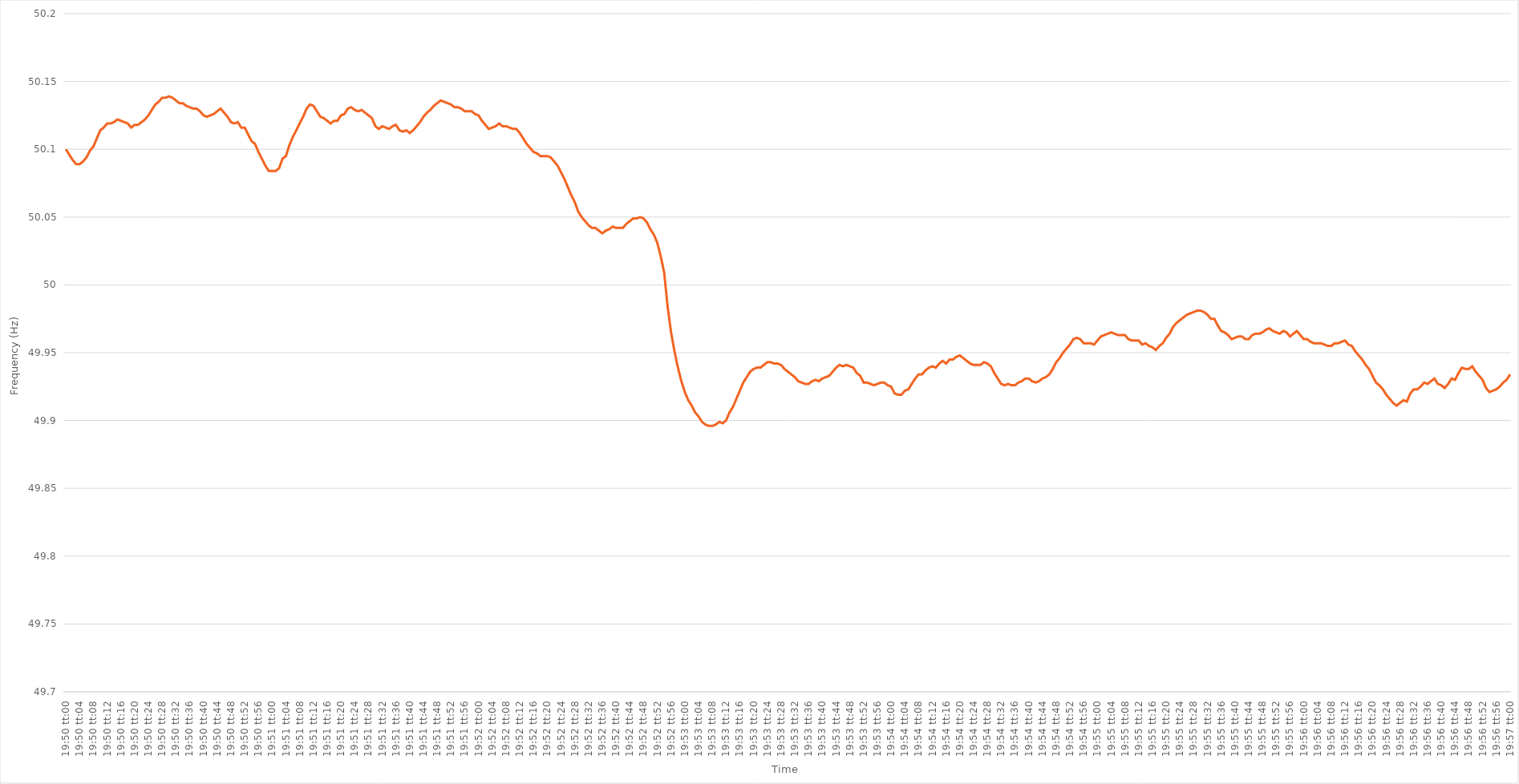
| Category | Series 0 |
|---|---|
| 0.8263888888888888 | 50.1 |
| 0.826400462962963 | 50.096 |
| 0.826412037037037 | 50.092 |
| 0.8264236111111112 | 50.089 |
| 0.8264351851851851 | 50.089 |
| 0.8264467592592593 | 50.091 |
| 0.8264583333333334 | 50.094 |
| 0.8264699074074073 | 50.099 |
| 0.8264814814814815 | 50.102 |
| 0.8264930555555555 | 50.108 |
| 0.8265046296296297 | 50.114 |
| 0.8265162037037036 | 50.116 |
| 0.8265277777777778 | 50.119 |
| 0.8265393518518519 | 50.119 |
| 0.8265509259259259 | 50.12 |
| 0.8265625 | 50.122 |
| 0.826574074074074 | 50.121 |
| 0.8265856481481482 | 50.12 |
| 0.8265972222222223 | 50.119 |
| 0.8266087962962962 | 50.116 |
| 0.8266203703703704 | 50.118 |
| 0.8266319444444444 | 50.118 |
| 0.8266435185185186 | 50.12 |
| 0.8266550925925925 | 50.122 |
| 0.8266666666666667 | 50.125 |
| 0.8266782407407408 | 50.129 |
| 0.8266898148148147 | 50.133 |
| 0.8267013888888889 | 50.135 |
| 0.8267129629629629 | 50.138 |
| 0.8267245370370371 | 50.138 |
| 0.826736111111111 | 50.139 |
| 0.8267476851851852 | 50.138 |
| 0.8267592592592593 | 50.136 |
| 0.8267708333333333 | 50.134 |
| 0.8267824074074074 | 50.134 |
| 0.8267939814814814 | 50.132 |
| 0.8268055555555556 | 50.131 |
| 0.8268171296296297 | 50.13 |
| 0.8268287037037036 | 50.13 |
| 0.8268402777777778 | 50.128 |
| 0.8268518518518518 | 50.125 |
| 0.826863425925926 | 50.124 |
| 0.8268749999999999 | 50.125 |
| 0.8268865740740741 | 50.126 |
| 0.8268981481481482 | 50.128 |
| 0.8269097222222223 | 50.13 |
| 0.8269212962962963 | 50.127 |
| 0.8269328703703703 | 50.124 |
| 0.8269444444444445 | 50.12 |
| 0.8269560185185186 | 50.119 |
| 0.8269675925925926 | 50.12 |
| 0.8269791666666667 | 50.116 |
| 0.8269907407407407 | 50.116 |
| 0.8270023148148148 | 50.111 |
| 0.8270138888888888 | 50.106 |
| 0.827025462962963 | 50.104 |
| 0.8270370370370371 | 50.098 |
| 0.827048611111111 | 50.093 |
| 0.8270601851851852 | 50.088 |
| 0.8270717592592592 | 50.084 |
| 0.8270833333333334 | 50.084 |
| 0.8270949074074073 | 50.084 |
| 0.8271064814814815 | 50.086 |
| 0.8271180555555556 | 50.093 |
| 0.8271296296296297 | 50.095 |
| 0.8271412037037037 | 50.103 |
| 0.8271527777777777 | 50.109 |
| 0.8271643518518519 | 50.114 |
| 0.827175925925926 | 50.119 |
| 0.8271875 | 50.124 |
| 0.8271990740740741 | 50.13 |
| 0.8272106481481482 | 50.133 |
| 0.8272222222222222 | 50.132 |
| 0.8272337962962962 | 50.128 |
| 0.8272453703703704 | 50.124 |
| 0.8272569444444445 | 50.123 |
| 0.8272685185185185 | 50.121 |
| 0.8272800925925926 | 50.119 |
| 0.8272916666666666 | 50.121 |
| 0.8273032407407408 | 50.121 |
| 0.8273148148148147 | 50.125 |
| 0.8273263888888889 | 50.126 |
| 0.827337962962963 | 50.13 |
| 0.8273495370370371 | 50.131 |
| 0.8273611111111111 | 50.129 |
| 0.8273726851851851 | 50.128 |
| 0.8273842592592593 | 50.129 |
| 0.8273958333333334 | 50.127 |
| 0.8274074074074074 | 50.125 |
| 0.8274189814814815 | 50.123 |
| 0.8274305555555556 | 50.117 |
| 0.8274421296296296 | 50.115 |
| 0.8274537037037036 | 50.117 |
| 0.8274652777777778 | 50.116 |
| 0.8274768518518519 | 50.115 |
| 0.8274884259259259 | 50.117 |
| 0.8275 | 50.118 |
| 0.827511574074074 | 50.114 |
| 0.8275231481481482 | 50.113 |
| 0.8275347222222221 | 50.114 |
| 0.8275462962962963 | 50.112 |
| 0.8275578703703704 | 50.114 |
| 0.8275694444444445 | 50.117 |
| 0.8275810185185185 | 50.12 |
| 0.8275925925925925 | 50.124 |
| 0.8276041666666667 | 50.127 |
| 0.8276157407407408 | 50.129 |
| 0.8276273148148148 | 50.132 |
| 0.8276388888888889 | 50.134 |
| 0.827650462962963 | 50.136 |
| 0.827662037037037 | 50.135 |
| 0.827673611111111 | 50.134 |
| 0.8276851851851852 | 50.133 |
| 0.8276967592592593 | 50.131 |
| 0.8277083333333333 | 50.131 |
| 0.8277199074074074 | 50.13 |
| 0.8277314814814815 | 50.128 |
| 0.8277430555555556 | 50.128 |
| 0.8277546296296295 | 50.128 |
| 0.8277662037037037 | 50.126 |
| 0.8277777777777778 | 50.125 |
| 0.8277893518518519 | 50.121 |
| 0.8278009259259259 | 50.118 |
| 0.8278125 | 50.115 |
| 0.8278240740740741 | 50.116 |
| 0.8278356481481483 | 50.117 |
| 0.8278472222222222 | 50.119 |
| 0.8278587962962963 | 50.117 |
| 0.8278703703703704 | 50.117 |
| 0.8278819444444444 | 50.116 |
| 0.8278935185185184 | 50.115 |
| 0.8279050925925926 | 50.115 |
| 0.8279166666666667 | 50.112 |
| 0.8279282407407407 | 50.108 |
| 0.8279398148148148 | 50.104 |
| 0.8279513888888889 | 50.101 |
| 0.827962962962963 | 50.098 |
| 0.8279745370370369 | 50.097 |
| 0.8279861111111111 | 50.095 |
| 0.8279976851851852 | 50.095 |
| 0.8280092592592593 | 50.095 |
| 0.8280208333333333 | 50.094 |
| 0.8280324074074074 | 50.091 |
| 0.8280439814814815 | 50.088 |
| 0.8280555555555557 | 50.083 |
| 0.8280671296296296 | 50.078 |
| 0.8280787037037037 | 50.072 |
| 0.8280902777777778 | 50.066 |
| 0.8281018518518519 | 50.061 |
| 0.8281134259259259 | 50.054 |
| 0.828125 | 50.05 |
| 0.8281365740740741 | 50.047 |
| 0.8281481481481481 | 50.044 |
| 0.8281597222222222 | 50.042 |
| 0.8281712962962963 | 50.042 |
| 0.8281828703703704 | 50.04 |
| 0.8281944444444443 | 50.038 |
| 0.8282060185185185 | 50.04 |
| 0.8282175925925926 | 50.041 |
| 0.8282291666666667 | 50.043 |
| 0.8282407407407407 | 50.042 |
| 0.8282523148148148 | 50.042 |
| 0.8282638888888889 | 50.042 |
| 0.8282754629629631 | 50.045 |
| 0.828287037037037 | 50.047 |
| 0.8282986111111111 | 50.049 |
| 0.8283101851851852 | 50.049 |
| 0.8283217592592593 | 50.05 |
| 0.8283333333333333 | 50.049 |
| 0.8283449074074074 | 50.046 |
| 0.8283564814814816 | 50.041 |
| 0.8283680555555556 | 50.037 |
| 0.8283796296296296 | 50.031 |
| 0.8283912037037037 | 50.021 |
| 0.8284027777777778 | 50.009 |
| 0.8284143518518517 | 49.984 |
| 0.8284259259259259 | 49.965 |
| 0.8284375 | 49.951 |
| 0.8284490740740741 | 49.939 |
| 0.8284606481481481 | 49.929 |
| 0.8284722222222222 | 49.921 |
| 0.8284837962962963 | 49.915 |
| 0.8284953703703705 | 49.911 |
| 0.8285069444444444 | 49.906 |
| 0.8285185185185185 | 49.903 |
| 0.8285300925925926 | 49.899 |
| 0.8285416666666667 | 49.897 |
| 0.8285532407407407 | 49.896 |
| 0.8285648148148148 | 49.896 |
| 0.828576388888889 | 49.897 |
| 0.828587962962963 | 49.899 |
| 0.828599537037037 | 49.898 |
| 0.8286111111111111 | 49.9 |
| 0.8286226851851852 | 49.906 |
| 0.8286342592592592 | 49.91 |
| 0.8286458333333333 | 49.916 |
| 0.8286574074074075 | 49.922 |
| 0.8286689814814815 | 49.928 |
| 0.8286805555555555 | 49.932 |
| 0.8286921296296296 | 49.936 |
| 0.8287037037037037 | 49.938 |
| 0.8287152777777779 | 49.939 |
| 0.8287268518518518 | 49.939 |
| 0.828738425925926 | 49.941 |
| 0.82875 | 49.943 |
| 0.8287615740740741 | 49.943 |
| 0.8287731481481481 | 49.942 |
| 0.8287847222222222 | 49.942 |
| 0.8287962962962964 | 49.941 |
| 0.8288078703703704 | 49.938 |
| 0.8288194444444444 | 49.936 |
| 0.8288310185185185 | 49.934 |
| 0.8288425925925926 | 49.932 |
| 0.8288541666666666 | 49.929 |
| 0.8288657407407407 | 49.928 |
| 0.8288773148148149 | 49.927 |
| 0.8288888888888889 | 49.927 |
| 0.8289004629629629 | 49.929 |
| 0.828912037037037 | 49.93 |
| 0.8289236111111111 | 49.929 |
| 0.8289351851851853 | 49.931 |
| 0.8289467592592592 | 49.932 |
| 0.8289583333333334 | 49.933 |
| 0.8289699074074074 | 49.936 |
| 0.8289814814814815 | 49.939 |
| 0.8289930555555555 | 49.941 |
| 0.8290046296296296 | 49.94 |
| 0.8290162037037038 | 49.941 |
| 0.8290277777777778 | 49.94 |
| 0.8290393518518518 | 49.939 |
| 0.8290509259259259 | 49.935 |
| 0.8290625 | 49.933 |
| 0.829074074074074 | 49.928 |
| 0.8290856481481481 | 49.928 |
| 0.8290972222222223 | 49.927 |
| 0.8291087962962963 | 49.926 |
| 0.8291203703703703 | 49.927 |
| 0.8291319444444444 | 49.928 |
| 0.8291435185185185 | 49.928 |
| 0.8291550925925927 | 49.926 |
| 0.8291666666666666 | 49.925 |
| 0.8291782407407408 | 49.92 |
| 0.8291898148148148 | 49.919 |
| 0.829201388888889 | 49.919 |
| 0.8292129629629629 | 49.922 |
| 0.829224537037037 | 49.923 |
| 0.8292361111111112 | 49.927 |
| 0.8292476851851852 | 49.931 |
| 0.8292592592592593 | 49.934 |
| 0.8292708333333333 | 49.934 |
| 0.8292824074074074 | 49.937 |
| 0.8292939814814814 | 49.939 |
| 0.8293055555555555 | 49.94 |
| 0.8293171296296297 | 49.939 |
| 0.8293287037037037 | 49.942 |
| 0.8293402777777777 | 49.944 |
| 0.8293518518518518 | 49.942 |
| 0.8293634259259259 | 49.945 |
| 0.8293750000000001 | 49.945 |
| 0.829386574074074 | 49.947 |
| 0.8293981481481482 | 49.948 |
| 0.8294097222222222 | 49.946 |
| 0.8294212962962964 | 49.944 |
| 0.8294328703703703 | 49.942 |
| 0.8294444444444444 | 49.941 |
| 0.8294560185185186 | 49.941 |
| 0.8294675925925926 | 49.941 |
| 0.8294791666666667 | 49.943 |
| 0.8294907407407407 | 49.942 |
| 0.8295023148148148 | 49.94 |
| 0.829513888888889 | 49.935 |
| 0.8295254629629629 | 49.931 |
| 0.8295370370370371 | 49.927 |
| 0.8295486111111111 | 49.926 |
| 0.8295601851851853 | 49.927 |
| 0.8295717592592592 | 49.926 |
| 0.8295833333333333 | 49.926 |
| 0.8295949074074075 | 49.928 |
| 0.8296064814814814 | 49.929 |
| 0.8296180555555556 | 49.931 |
| 0.8296296296296296 | 49.931 |
| 0.8296412037037038 | 49.929 |
| 0.8296527777777777 | 49.928 |
| 0.8296643518518518 | 49.929 |
| 0.829675925925926 | 49.931 |
| 0.8296875 | 49.932 |
| 0.8296990740740741 | 49.934 |
| 0.8297106481481481 | 49.938 |
| 0.8297222222222222 | 49.943 |
| 0.8297337962962964 | 49.946 |
| 0.8297453703703703 | 49.95 |
| 0.8297569444444445 | 49.953 |
| 0.8297685185185185 | 49.956 |
| 0.8297800925925927 | 49.96 |
| 0.8297916666666666 | 49.961 |
| 0.8298032407407407 | 49.96 |
| 0.8298148148148149 | 49.957 |
| 0.8298263888888888 | 49.957 |
| 0.829837962962963 | 49.957 |
| 0.829849537037037 | 49.956 |
| 0.8298611111111112 | 49.959 |
| 0.8298726851851851 | 49.962 |
| 0.8298842592592592 | 49.963 |
| 0.8298958333333334 | 49.964 |
| 0.8299074074074074 | 49.965 |
| 0.8299189814814815 | 49.964 |
| 0.8299305555555555 | 49.963 |
| 0.8299421296296297 | 49.963 |
| 0.8299537037037038 | 49.963 |
| 0.8299652777777777 | 49.96 |
| 0.8299768518518519 | 49.959 |
| 0.8299884259259259 | 49.959 |
| 0.8300000000000001 | 49.959 |
| 0.830011574074074 | 49.956 |
| 0.8300231481481481 | 49.957 |
| 0.8300347222222223 | 49.955 |
| 0.8300462962962962 | 49.954 |
| 0.8300578703703704 | 49.952 |
| 0.8300694444444444 | 49.955 |
| 0.8300810185185186 | 49.957 |
| 0.8300925925925925 | 49.961 |
| 0.8301041666666666 | 49.964 |
| 0.8301157407407408 | 49.969 |
| 0.8301273148148148 | 49.972 |
| 0.8301388888888889 | 49.974 |
| 0.8301504629629629 | 49.976 |
| 0.8301620370370371 | 49.978 |
| 0.8301736111111112 | 49.979 |
| 0.8301851851851851 | 49.98 |
| 0.8301967592592593 | 49.981 |
| 0.8302083333333333 | 49.981 |
| 0.8302199074074075 | 49.98 |
| 0.8302314814814814 | 49.978 |
| 0.8302430555555556 | 49.975 |
| 0.8302546296296297 | 49.975 |
| 0.8302662037037036 | 49.97 |
| 0.8302777777777778 | 49.966 |
| 0.8302893518518518 | 49.965 |
| 0.830300925925926 | 49.963 |
| 0.8303124999999999 | 49.96 |
| 0.830324074074074 | 49.961 |
| 0.8303356481481482 | 49.962 |
| 0.8303472222222222 | 49.962 |
| 0.8303587962962963 | 49.96 |
| 0.8303703703703703 | 49.96 |
| 0.8303819444444445 | 49.963 |
| 0.8303935185185186 | 49.964 |
| 0.8304050925925925 | 49.964 |
| 0.8304166666666667 | 49.965 |
| 0.8304282407407407 | 49.967 |
| 0.8304398148148149 | 49.968 |
| 0.8304513888888888 | 49.966 |
| 0.830462962962963 | 49.965 |
| 0.8304745370370371 | 49.964 |
| 0.830486111111111 | 49.966 |
| 0.8304976851851852 | 49.965 |
| 0.8305092592592592 | 49.962 |
| 0.8305208333333334 | 49.964 |
| 0.8305324074074073 | 49.966 |
| 0.8305439814814815 | 49.963 |
| 0.8305555555555556 | 49.96 |
| 0.8305671296296296 | 49.96 |
| 0.8305787037037037 | 49.958 |
| 0.8305902777777777 | 49.957 |
| 0.8306018518518519 | 49.957 |
| 0.830613425925926 | 49.957 |
| 0.830625 | 49.956 |
| 0.8306365740740741 | 49.955 |
| 0.8306481481481481 | 49.955 |
| 0.8306597222222223 | 49.957 |
| 0.8306712962962962 | 49.957 |
| 0.8306828703703704 | 49.958 |
| 0.8306944444444445 | 49.959 |
| 0.8307060185185186 | 49.956 |
| 0.8307175925925926 | 49.955 |
| 0.8307291666666666 | 49.951 |
| 0.8307407407407408 | 49.948 |
| 0.8307523148148147 | 49.945 |
| 0.8307638888888889 | 49.941 |
| 0.830775462962963 | 49.938 |
| 0.830787037037037 | 49.933 |
| 0.8307986111111111 | 49.928 |
| 0.8308101851851851 | 49.926 |
| 0.8308217592592593 | 49.923 |
| 0.8308333333333334 | 49.919 |
| 0.8308449074074074 | 49.916 |
| 0.8308564814814815 | 49.913 |
| 0.8308680555555555 | 49.911 |
| 0.8308796296296297 | 49.913 |
| 0.8308912037037036 | 49.915 |
| 0.8309027777777778 | 49.914 |
| 0.8309143518518519 | 49.92 |
| 0.830925925925926 | 49.923 |
| 0.8309375 | 49.923 |
| 0.830949074074074 | 49.925 |
| 0.8309606481481482 | 49.928 |
| 0.8309722222222223 | 49.927 |
| 0.8309837962962963 | 49.929 |
| 0.8309953703703704 | 49.931 |
| 0.8310069444444445 | 49.927 |
| 0.8310185185185185 | 49.926 |
| 0.8310300925925925 | 49.924 |
| 0.8310416666666667 | 49.927 |
| 0.8310532407407408 | 49.931 |
| 0.8310648148148148 | 49.93 |
| 0.8310763888888889 | 49.935 |
| 0.831087962962963 | 49.939 |
| 0.8310995370370371 | 49.938 |
| 0.831111111111111 | 49.938 |
| 0.8311226851851852 | 49.94 |
| 0.8311342592592593 | 49.936 |
| 0.8311458333333334 | 49.933 |
| 0.8311574074074074 | 49.93 |
| 0.8311689814814814 | 49.924 |
| 0.8311805555555556 | 49.921 |
| 0.8311921296296297 | 49.922 |
| 0.8312037037037037 | 49.923 |
| 0.8312152777777778 | 49.925 |
| 0.8312268518518519 | 49.928 |
| 0.8312384259259259 | 49.93 |
| 0.8312499999999999 | 49.934 |